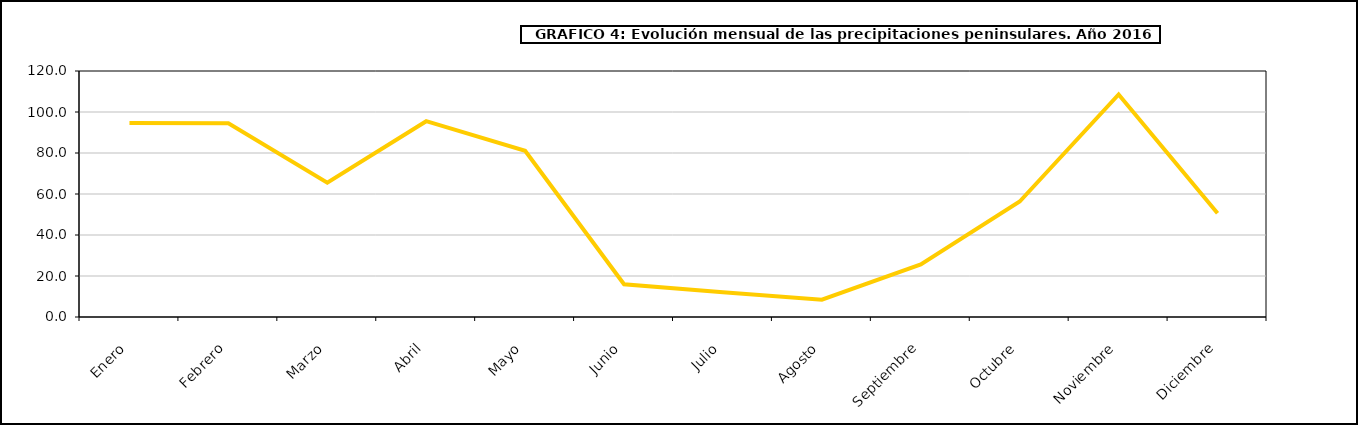
| Category | peninsula |
|---|---|
| 0 | 94.655 |
| 1 | 94.535 |
| 2 | 65.513 |
| 3 | 95.51 |
| 4 | 81.087 |
| 5 | 15.972 |
| 6 | 12.071 |
| 7 | 8.422 |
| 8 | 25.659 |
| 9 | 56.322 |
| 10 | 108.556 |
| 11 | 50.606 |